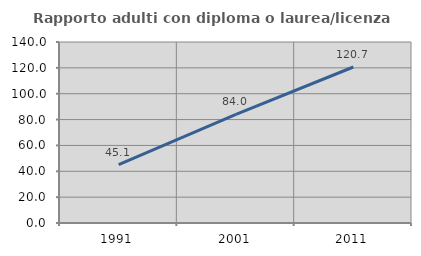
| Category | Rapporto adulti con diploma o laurea/licenza media  |
|---|---|
| 1991.0 | 45.067 |
| 2001.0 | 83.953 |
| 2011.0 | 120.661 |